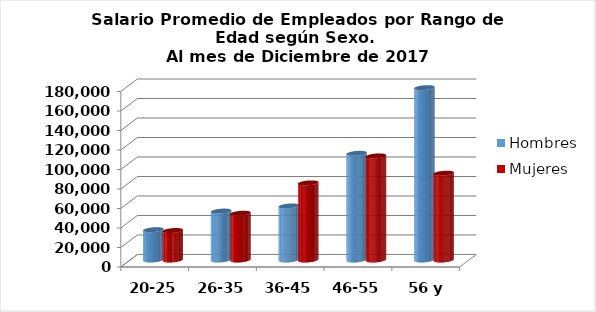
| Category | Hombres | Mujeres |
|---|---|---|
| 20-25 | 31078.889 | 30221.875 |
| 26-35 | 50158.787 | 47931.568 |
| 36-45 | 55422.705 | 79079.198 |
| 46-55 | 109420.408 | 106732.711 |
| 56 y más | 176801.585 | 89047.35 |